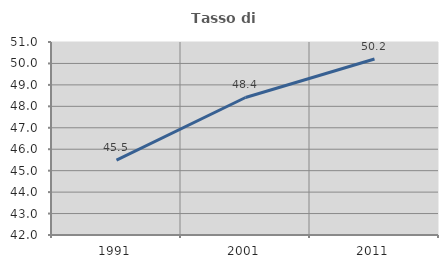
| Category | Tasso di occupazione   |
|---|---|
| 1991.0 | 45.49 |
| 2001.0 | 48.412 |
| 2011.0 | 50.209 |